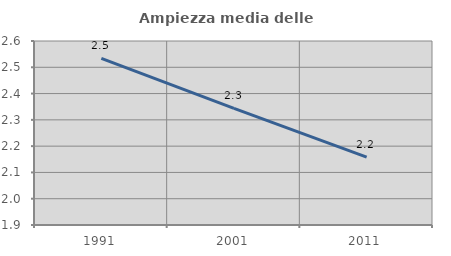
| Category | Ampiezza media delle famiglie |
|---|---|
| 1991.0 | 2.534 |
| 2001.0 | 2.344 |
| 2011.0 | 2.158 |